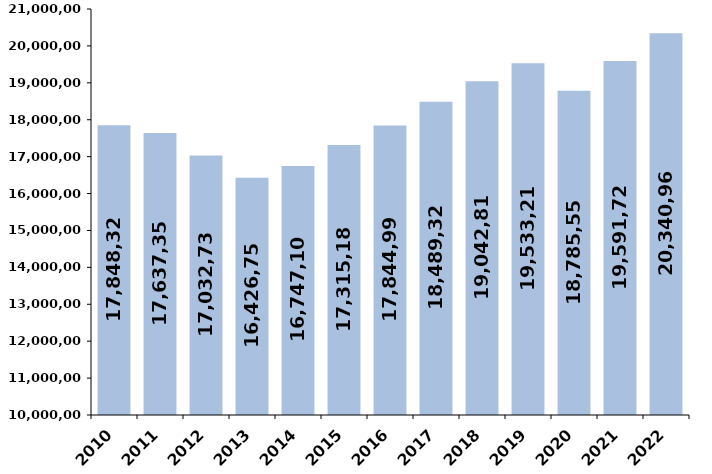
| Category | % de variación
 interanual |
|---|---|
| 2010 | 17848322.63 |
| 2011 | 17637351.66 |
| 2012 | 17032738.45 |
| 2013 | 16426755.78 |
| 2014 | 16747102.65 |
| 2015 | 17315187.56 |
| 2016 | 17844991.92 |
| 2017 | 18489328.95 |
| 2018 | 19042809.68 |
| 2019 | 19533210.73 |
| 2020 | 18785554 |
| 2021 | 19591728 |
| 2022 | 20340964.238 |